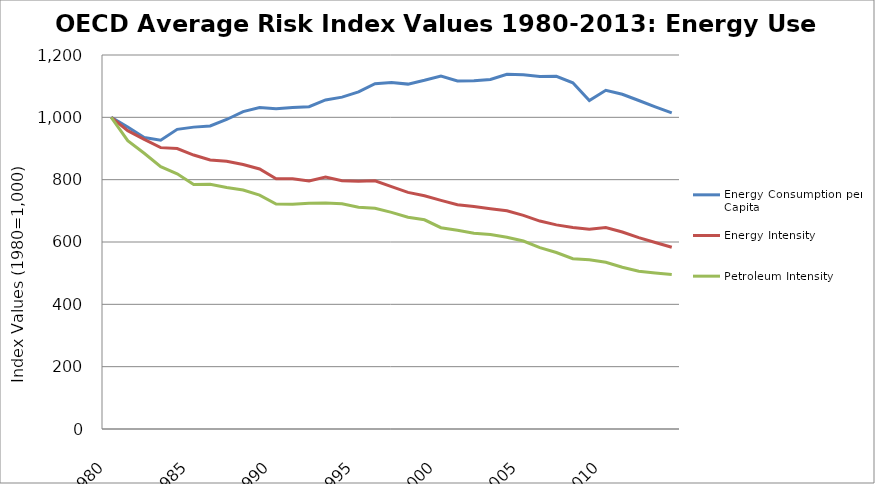
| Category | Energy Consumption per Capita | Energy Intensity | Petroleum Intensity |
|---|---|---|---|
| 1980.0 | 1000 | 1000 | 1000 |
| 1981.0 | 968.693 | 957.252 | 925.216 |
| 1982.0 | 935.051 | 929.18 | 884.867 |
| 1983.0 | 926.597 | 902.779 | 841.648 |
| 1984.0 | 961.47 | 899.663 | 818.86 |
| 1985.0 | 968.573 | 879.027 | 784.605 |
| 1986.0 | 972.491 | 863.218 | 785.496 |
| 1987.0 | 993.081 | 858.967 | 775.098 |
| 1988.0 | 1018.479 | 848.431 | 766.894 |
| 1989.0 | 1031.789 | 834.213 | 750.262 |
| 1990.0 | 1027.74 | 802.887 | 721.757 |
| 1991.0 | 1031.465 | 803.162 | 721.197 |
| 1992.0 | 1034.038 | 795.911 | 724.104 |
| 1993.0 | 1055.941 | 808.214 | 724.992 |
| 1994.0 | 1064.758 | 796.579 | 722.377 |
| 1995.0 | 1081.451 | 794.688 | 711.676 |
| 1996.0 | 1108.071 | 796.554 | 708.043 |
| 1997.0 | 1112.087 | 777.807 | 694.962 |
| 1998.0 | 1106.602 | 759.324 | 679.568 |
| 1999.0 | 1118.749 | 748.359 | 671.265 |
| 2000.0 | 1132.175 | 733.575 | 645.819 |
| 2001.0 | 1116.577 | 719.471 | 637.423 |
| 2002.0 | 1117.427 | 714.053 | 627.991 |
| 2003.0 | 1121.298 | 707.025 | 624.361 |
| 2004.0 | 1138.337 | 700.236 | 615.395 |
| 2005.0 | 1136.46 | 685.459 | 603.17 |
| 2006.0 | 1131.154 | 667.145 | 582.102 |
| 2007.0 | 1131.568 | 654.996 | 566.277 |
| 2008.0 | 1110.807 | 646.831 | 546.56 |
| 2009.0 | 1053.959 | 640.896 | 543.117 |
| 2010.0 | 1086.804 | 646.299 | 535.051 |
| 2011.0 | 1074.151 | 631.968 | 518.862 |
| 2012.0 | 1054.056 | 614.202 | 506.199 |
| 2013.0 | 1033.759 | 598.34 | 500.736 |
| 2014.0 | 1014.5 | 583.187 | 495.668 |